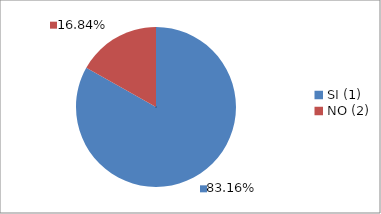
| Category | Series 0 |
|---|---|
| SI (1) | 0.832 |
| NO (2) | 0.168 |